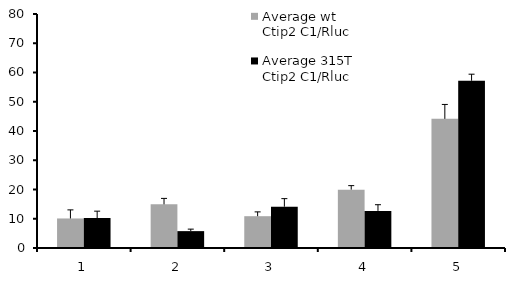
| Category | Average wt Ctip2 C1/Rluc | Average 315T Ctip2 C1/Rluc |
|---|---|---|
| 0 | 10.101 | 10.248 |
| 1 | 14.927 | 5.768 |
| 2 | 10.874 | 14.121 |
| 3 | 19.947 | 12.682 |
| 4 | 44.151 | 57.181 |